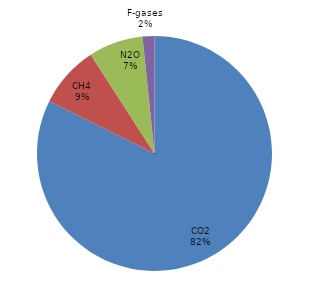
| Category | Total emissions (sectors 1-7, excluding 5. LULUCF) |
|---|---|
| CO2 | 4092.066 |
| CH4 | 423.282 |
| N2O | 372.753 |
| F-gases | 80.95 |